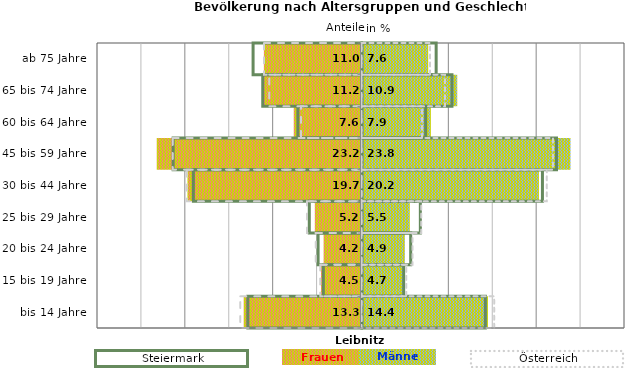
| Category | Frauen | Männer | Frauen Spalte2 | Männer Spalte2 | Frauen Spalte3 | Männer Spalte3 |
|---|---|---|---|---|---|---|
| bis 14 Jahre | -13.3 | 14.4 | 14.1 | -13 | -13.8 | 15.1 |
| 15 bis 19 Jahre | -4.5 | 4.7 | 4.8 | -4.4 | -4.7 | 5.1 |
| 20 bis 24 Jahre | -4.2 | 4.9 | 5.6 | -5 | -5.2 | 5.8 |
| 25 bis 29 Jahre | -5.2 | 5.5 | 6.7 | -6 | -6.2 | 6.8 |
| 30 bis 44 Jahre | -19.7 | 20.2 | 20.6 | -19.2 | -19.9 | 21.1 |
| 45 bis 59 Jahre | -23.2 | 23.8 | 22.2 | -21.5 | -21.5 | 21.8 |
| 60 bis 64 Jahre | -7.6 | 7.9 | 7.3 | -7.3 | -6.9 | 6.9 |
| 65 bis 74 Jahre | -11.2 | 10.9 | 10.3 | -11.3 | -10.5 | 9.5 |
| ab 75 Jahre | -11 | 7.6 | 8.5 | -12.4 | -11.1 | 7.8 |